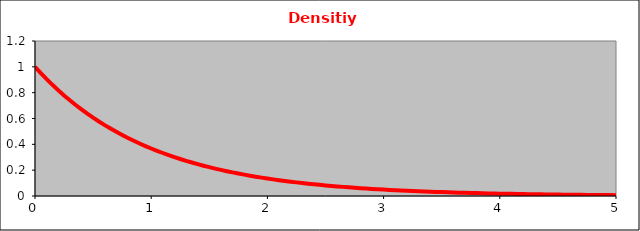
| Category | density function |
|---|---|
| 0.0 | 1 |
| 0.05 | 0.951 |
| 0.1 | 0.905 |
| 0.15 | 0.861 |
| 0.2 | 0.819 |
| 0.25 | 0.779 |
| 0.3 | 0.741 |
| 0.35 | 0.705 |
| 0.4 | 0.67 |
| 0.45 | 0.638 |
| 0.5 | 0.607 |
| 0.55 | 0.577 |
| 0.6 | 0.549 |
| 0.65 | 0.522 |
| 0.7 | 0.497 |
| 0.75 | 0.472 |
| 0.8 | 0.449 |
| 0.85 | 0.427 |
| 0.9 | 0.407 |
| 0.95 | 0.387 |
| 1.0 | 0.368 |
| 1.05 | 0.35 |
| 1.1 | 0.333 |
| 1.15 | 0.317 |
| 1.2 | 0.301 |
| 1.25 | 0.287 |
| 1.3 | 0.273 |
| 1.35 | 0.259 |
| 1.4 | 0.247 |
| 1.45 | 0.235 |
| 1.5 | 0.223 |
| 1.55 | 0.212 |
| 1.6 | 0.202 |
| 1.65 | 0.192 |
| 1.7 | 0.183 |
| 1.75 | 0.174 |
| 1.8 | 0.165 |
| 1.85 | 0.157 |
| 1.9 | 0.15 |
| 1.95 | 0.142 |
| 2.0 | 0.135 |
| 2.05 | 0.129 |
| 2.1 | 0.122 |
| 2.15 | 0.116 |
| 2.2 | 0.111 |
| 2.25 | 0.105 |
| 2.3 | 0.1 |
| 2.35 | 0.095 |
| 2.4 | 0.091 |
| 2.45 | 0.086 |
| 2.5 | 0.082 |
| 2.55 | 0.078 |
| 2.6 | 0.074 |
| 2.65 | 0.071 |
| 2.7 | 0.067 |
| 2.75 | 0.064 |
| 2.8 | 0.061 |
| 2.85 | 0.058 |
| 2.9 | 0.055 |
| 2.95 | 0.052 |
| 3.0 | 0.05 |
| 3.05 | 0.047 |
| 3.1 | 0.045 |
| 3.15 | 0.043 |
| 3.2 | 0.041 |
| 3.25 | 0.039 |
| 3.3 | 0.037 |
| 3.35 | 0.035 |
| 3.4 | 0.033 |
| 3.45 | 0.032 |
| 3.5 | 0.03 |
| 3.55 | 0.029 |
| 3.6 | 0.027 |
| 3.65 | 0.026 |
| 3.7 | 0.025 |
| 3.75 | 0.024 |
| 3.8 | 0.022 |
| 3.85 | 0.021 |
| 3.9 | 0.02 |
| 3.95 | 0.019 |
| 4.0 | 0.018 |
| 4.05 | 0.017 |
| 4.1 | 0.017 |
| 4.15 | 0.016 |
| 4.2 | 0.015 |
| 4.25 | 0.014 |
| 4.3 | 0.014 |
| 4.35 | 0.013 |
| 4.4 | 0.012 |
| 4.45 | 0.012 |
| 4.5 | 0.011 |
| 4.55 | 0.011 |
| 4.6 | 0.01 |
| 4.65 | 0.01 |
| 4.7 | 0.009 |
| 4.75 | 0.009 |
| 4.8 | 0.008 |
| 4.85 | 0.008 |
| 4.9 | 0.007 |
| 4.95 | 0.007 |
| 5.0 | 0.007 |
| 5.05 | 0.006 |
| 5.1 | 0.006 |
| 5.15 | 0.006 |
| 5.2 | 0.006 |
| 5.25 | 0.005 |
| 5.3 | 0.005 |
| 5.35 | 0.005 |
| 5.4 | 0.005 |
| 5.45 | 0.004 |
| 5.5 | 0.004 |
| 5.55 | 0.004 |
| 5.6 | 0.004 |
| 5.65 | 0.004 |
| 5.7 | 0.003 |
| 5.75 | 0.003 |
| 5.8 | 0.003 |
| 5.85 | 0.003 |
| 5.9 | 0.003 |
| 5.95 | 0.003 |
| 6.0 | 0.002 |
| 6.05 | 0.002 |
| 6.1 | 0.002 |
| 6.15 | 0.002 |
| 6.2 | 0.002 |
| 6.25 | 0.002 |
| 6.3 | 0.002 |
| 6.35 | 0.002 |
| 6.4 | 0.002 |
| 6.45 | 0.002 |
| 6.5 | 0.002 |
| 6.55 | 0.001 |
| 6.6 | 0.001 |
| 6.65 | 0.001 |
| 6.7 | 0.001 |
| 6.75 | 0.001 |
| 6.8 | 0.001 |
| 6.85 | 0.001 |
| 6.9 | 0.001 |
| 6.95 | 0.001 |
| 7.0 | 0.001 |
| 7.05 | 0.001 |
| 7.1 | 0.001 |
| 7.15 | 0.001 |
| 7.2 | 0.001 |
| 7.25 | 0.001 |
| 7.3 | 0.001 |
| 7.35 | 0.001 |
| 7.4 | 0.001 |
| 7.45 | 0.001 |
| 7.5 | 0.001 |
| 7.55 | 0.001 |
| 7.6 | 0.001 |
| 7.65 | 0 |
| 7.7 | 0 |
| 7.75 | 0 |
| 7.8 | 0 |
| 7.85 | 0 |
| 7.9 | 0 |
| 7.95 | 0 |
| 8.0 | 0 |
| 8.05 | 0 |
| 8.1 | 0 |
| 8.15 | 0 |
| 8.2 | 0 |
| 8.25 | 0 |
| 8.3 | 0 |
| 8.35 | 0 |
| 8.4 | 0 |
| 8.45 | 0 |
| 8.5 | 0 |
| 8.55 | 0 |
| 8.6 | 0 |
| 8.65 | 0 |
| 8.7 | 0 |
| 8.75 | 0 |
| 8.8 | 0 |
| 8.85 | 0 |
| 8.9 | 0 |
| 8.95 | 0 |
| 9.0 | 0 |
| 9.05 | 0 |
| 9.1 | 0 |
| 9.15 | 0 |
| 9.2 | 0 |
| 9.25 | 0 |
| 9.3 | 0 |
| 9.35 | 0 |
| 9.4 | 0 |
| 9.45 | 0 |
| 9.5 | 0 |
| 9.55 | 0 |
| 9.6 | 0 |
| 9.65 | 0 |
| 9.7 | 0 |
| 9.75 | 0 |
| 9.8 | 0 |
| 9.85 | 0 |
| 9.9 | 0 |
| 9.95 | 0 |
| 10.0 | 0 |